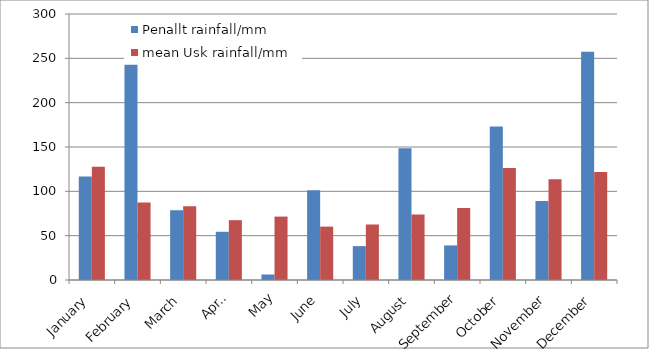
| Category | Penallt rainfall/mm | mean Usk rainfall/mm |
|---|---|---|
| January | 116.8 | 127.6 |
| February | 242.8 | 87.4 |
| March | 78.8 | 83.1 |
| April | 54.4 | 67.5 |
| May | 6.2 | 71.5 |
| June | 101.2 | 60.2 |
| July | 38.2 | 62.6 |
| August | 148.6 | 73.9 |
| September | 39 | 81.2 |
| October | 173.2 | 126.3 |
| November | 89 | 113.7 |
| December | 257.4 | 121.9 |